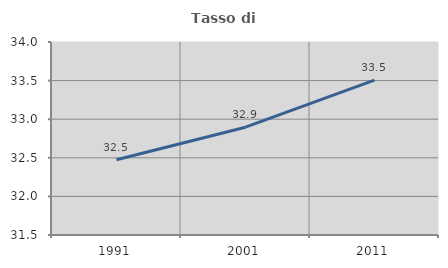
| Category | Tasso di occupazione   |
|---|---|
| 1991.0 | 32.475 |
| 2001.0 | 32.896 |
| 2011.0 | 33.507 |